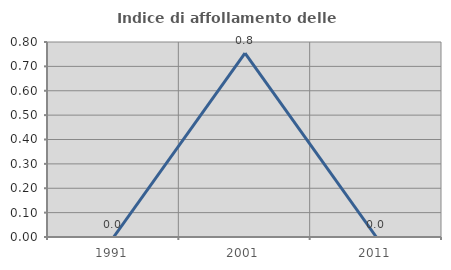
| Category | Indice di affollamento delle abitazioni  |
|---|---|
| 1991.0 | 0 |
| 2001.0 | 0.755 |
| 2011.0 | 0 |